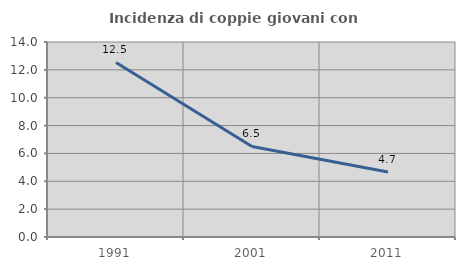
| Category | Incidenza di coppie giovani con figli |
|---|---|
| 1991.0 | 12.531 |
| 2001.0 | 6.499 |
| 2011.0 | 4.669 |